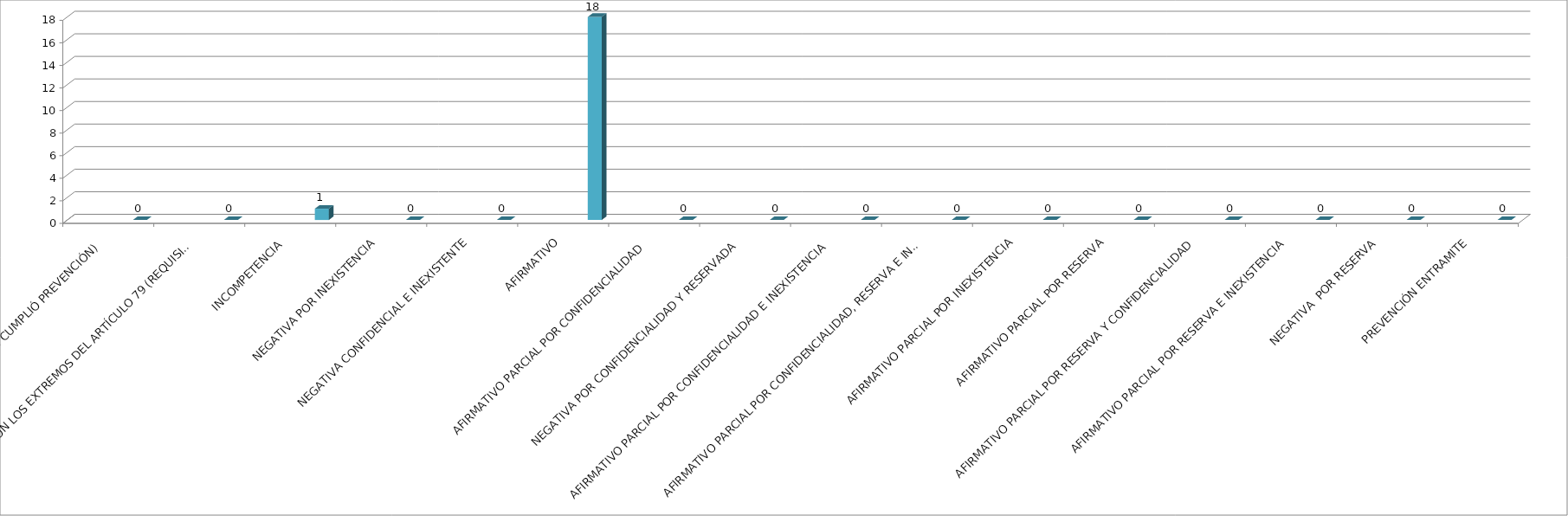
| Category | Series 0 | Series 1 | Series 2 | Series 3 | Series 4 |
|---|---|---|---|---|---|
| SE TIENE POR NO PRESENTADA ( NO CUMPLIÓ PREVENCIÓN) |  |  |  |  | 0 |
| NO CUMPLIO CON LOS EXTREMOS DEL ARTÍCULO 79 (REQUISITOS) |  |  |  |  | 0 |
| INCOMPETENCIA  |  |  |  |  | 1 |
| NEGATIVA POR INEXISTENCIA |  |  |  |  | 0 |
| NEGATIVA CONFIDENCIAL E INEXISTENTE |  |  |  |  | 0 |
| AFIRMATIVO |  |  |  |  | 18 |
| AFIRMATIVO PARCIAL POR CONFIDENCIALIDAD  |  |  |  |  | 0 |
| NEGATIVA POR CONFIDENCIALIDAD Y RESERVADA |  |  |  |  | 0 |
| AFIRMATIVO PARCIAL POR CONFIDENCIALIDAD E INEXISTENCIA |  |  |  |  | 0 |
| AFIRMATIVO PARCIAL POR CONFIDENCIALIDAD, RESERVA E INEXISTENCIA |  |  |  |  | 0 |
| AFIRMATIVO PARCIAL POR INEXISTENCIA |  |  |  |  | 0 |
| AFIRMATIVO PARCIAL POR RESERVA |  |  |  |  | 0 |
| AFIRMATIVO PARCIAL POR RESERVA Y CONFIDENCIALIDAD |  |  |  |  | 0 |
| AFIRMATIVO PARCIAL POR RESERVA E INEXISTENCIA |  |  |  |  | 0 |
| NEGATIVA  POR RESERVA |  |  |  |  | 0 |
| PREVENCIÓN ENTRAMITE |  |  |  |  | 0 |